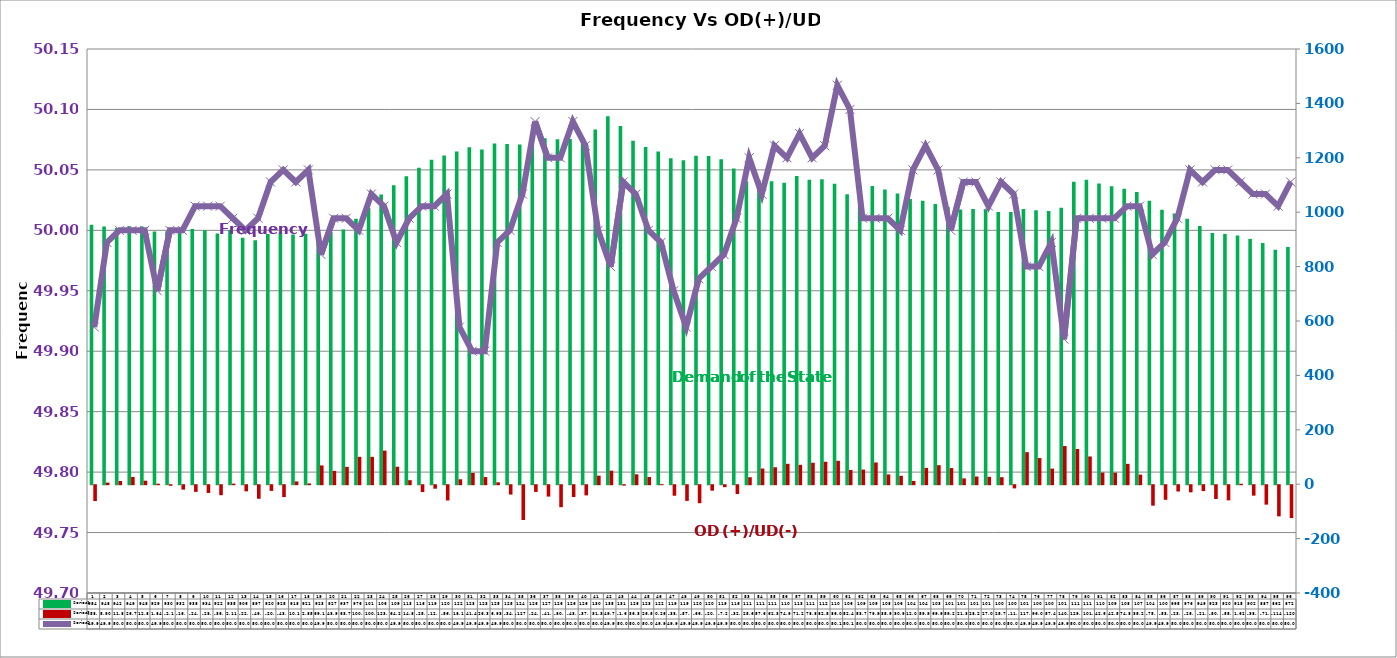
| Category | Series 2 | Series 4 |
|---|---|---|
| 0 | 953.87 | -58.26 |
| 1 | 947.87 | 5.9 |
| 2 | 942.3 | 11.85 |
| 3 | 948.5 | 26.72 |
| 4 | 947.85 | 12.87 |
| 5 | 929.26 | 1.84 |
| 6 | 929.68 | -2.15 |
| 7 | 931.55 | -16.31 |
| 8 | 937.94 | -24.51 |
| 9 | 933.97 | -28.49 |
| 10 | 921.81 | -36.89 |
| 11 | 934.78 | 2.11 |
| 12 | 905.64 | -22.59 |
| 13 | 897.31 | -49.89 |
| 14 | 919.85 | -20.97 |
| 15 | 925.46 | -43.6 |
| 16 | 917.95 | 10.17 |
| 17 | 921.06 | 2.85 |
| 18 | 922.95 | 69.11 |
| 19 | 927.3 | 48.99 |
| 20 | 936.64 | 63.78 |
| 21 | 975.53 | 100.7 |
| 22 | 1015.27 | 100.62 |
| 23 | 1065.29 | 123.45 |
| 24 | 1098.82 | 64.25 |
| 25 | 1132.05 | 14.82 |
| 26 | 1163.21 | -25.12 |
| 27 | 1193.15 | -12.82 |
| 28 | 1208.42 | -56.14 |
| 29 | 1223.19 | 18.15 |
| 30 | 1239.01 | 41.45 |
| 31 | 1230.16 | 26.32 |
| 32 | 1252.68 | 6.93 |
| 33 | 1250.5 | -34.43 |
| 34 | 1248.55 | -127.94 |
| 35 | 1269.24 | -24.74 |
| 36 | 1271.96 | -41.88 |
| 37 | 1268.14 | -80.86 |
| 38 | 1268.92 | -43.52 |
| 39 | 1265.49 | -37.43 |
| 40 | 1304.13 | 31.38 |
| 41 | 1352.68 | 49.75 |
| 42 | 1316.85 | -1.69 |
| 43 | 1262.61 | 36.35 |
| 44 | 1239.26 | 26.57 |
| 45 | 1222.79 | 0.26 |
| 46 | 1198.77 | -38.73 |
| 47 | 1190.98 | -57.72 |
| 48 | 1207.77 | -66.22 |
| 49 | 1206.42 | -20.15 |
| 50 | 1194.25 | -7.22 |
| 51 | 1160.31 | -32.31 |
| 52 | 1114.12 | 25.69 |
| 53 | 1117.81 | 57.67 |
| 54 | 1113.62 | 62.34 |
| 55 | 1108.28 | 74.91 |
| 56 | 1133.35 | 71.24 |
| 57 | 1119.11 | 78.89 |
| 58 | 1121.18 | 82.54 |
| 59 | 1104.51 | 86 |
| 60 | 1065.64 | 52.46 |
| 61 | 1097.28 | 53.77 |
| 62 | 1096.19 | 79.99 |
| 63 | 1083.65 | 35.92 |
| 64 | 1068.99 | 30.99 |
| 65 | 1048.86 | 12 |
| 66 | 1042.47 | 59.92 |
| 67 | 1030.12 | 69.97 |
| 68 | 1018.79 | 59.29 |
| 69 | 1010.27 | 21.31 |
| 70 | 1012.15 | 28.29 |
| 71 | 1011.03 | 27.09 |
| 72 | 1000.79 | 25.78 |
| 73 | 1001.05 | -11.77 |
| 74 | 1011.56 | 117.82 |
| 75 | 1007.52 | 96.07 |
| 76 | 1004.07 | 57.46 |
| 77 | 1015.91 | 140.3 |
| 78 | 1112.01 | 129.69 |
| 79 | 1118.96 | 101.97 |
| 80 | 1105.49 | 42.64 |
| 81 | 1095.15 | 42.56 |
| 82 | 1086.46 | 74.84 |
| 83 | 1074.65 | 35.22 |
| 84 | 1042.28 | -75.28 |
| 85 | 1008.95 | -53.63 |
| 86 | 994.79 | -23.2 |
| 87 | 975.65 | -26.16 |
| 88 | 949.32 | -21.55 |
| 89 | 923.32 | -50.58 |
| 90 | 920.23 | -55.75 |
| 91 | 914.73 | 1.62 |
| 92 | 901.95 | -38.37 |
| 93 | 886.6 | -71.42 |
| 94 | 862.19 | -114.47 |
| 95 | 872.28 | -120.86 |